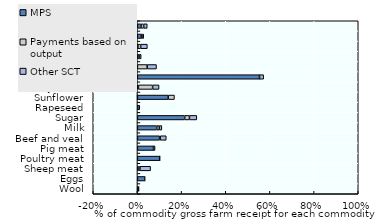
| Category | MPS | Payments based on output | Other SCT |
|---|---|---|---|
| Wool | 0 | 0.006 | 0 |
| Eggs | 0.033 | 0.001 | 0 |
| Sheep meat | 0.005 | 0.006 | 0.048 |
| Poultry meat | 0.101 | 0 | 0 |
| Pig meat | 0.073 | 0 | 0.007 |
| Beef and veal | 0.1 | 0.003 | 0.028 |
| Milk | 0.088 | 0.012 | 0.011 |
| Sugar | 0.214 | 0.021 | 0.033 |
| Rapeseed | 0.002 | 0 | 0.009 |
| Sunflower | 0.139 | 0.028 | 0 |
| Soybeans | 0.005 | 0.064 | 0.029 |
| Rice | 0.553 | 0 | 0.019 |
| Sorghum | 0 | 0.044 | 0.042 |
| Oats | 0.007 | 0.002 | 0.008 |
| Maize | 0.002 | 0.012 | 0.03 |
| Barley | 0.017 | 0.008 | 0.003 |
| Wheat | 0.017 | 0.012 | 0.016 |